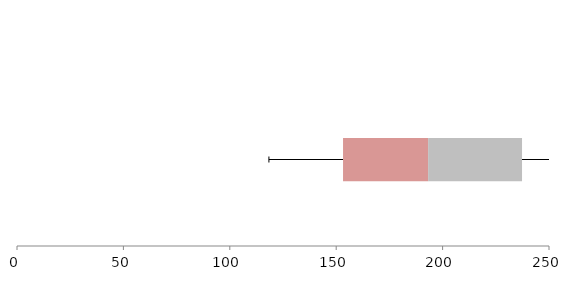
| Category | Series 1 | Series 2 | Series 3 |
|---|---|---|---|
| 0 | 153.21 | 39.993 | 44.12 |